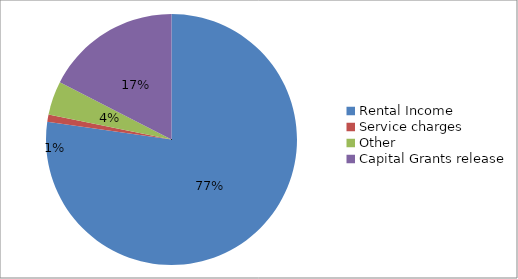
| Category | Series 0 |
|---|---|
| Rental Income | 0.773 |
| Service charges | 0.009 |
| Other | 0.044 |
| Capital Grants release | 0.174 |